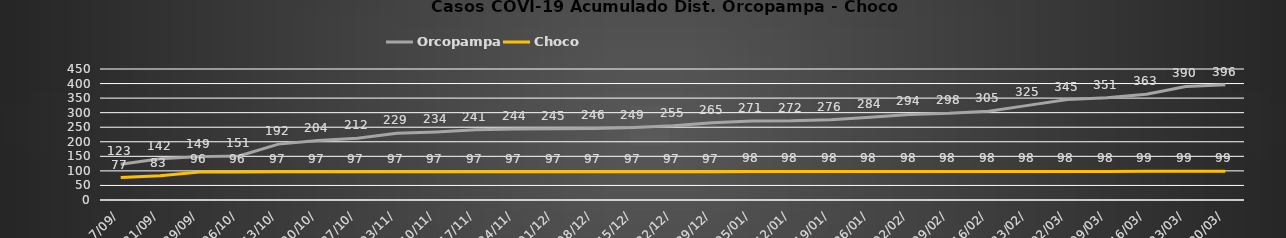
| Category | Orcopampa | Choco |
|---|---|---|
| 7/09/ | 123 | 77 |
| 21/09/ | 142 | 83 |
| 29/09/ | 149 | 96 |
| 06/10/ | 151 | 96 |
| 13/10/ | 192 | 97 |
| 20/10/ | 204 | 97 |
| 27/10/ | 212 | 97 |
| 03/11/ | 229 | 97 |
| 10/11/ | 234 | 97 |
| 17/11/ | 241 | 97 |
| 24/11/ | 244 | 97 |
| 01/12/ | 245 | 97 |
| 08/12/ | 246 | 97 |
| 15/12/ | 249 | 97 |
| 22/12/ | 255 | 97 |
| 29/12/ | 265 | 97 |
| 05/01/ | 271 | 98 |
| 12/01/ | 272 | 98 |
| 19/01/ | 276 | 98 |
| 26/01/ | 284 | 98 |
| 02/02/ | 294 | 98 |
| 09/02/ | 298 | 98 |
| 16/02/ | 305 | 98 |
| 23/02/ | 325 | 98 |
| 02/03/ | 345 | 98 |
| 09/03/ | 351 | 98 |
| 16/03/ | 363 | 99 |
| 23/03/ | 390 | 99 |
| 30/03/ | 396 | 99 |